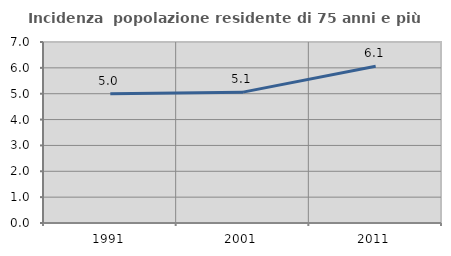
| Category | Incidenza  popolazione residente di 75 anni e più |
|---|---|
| 1991.0 | 5.002 |
| 2001.0 | 5.061 |
| 2011.0 | 6.061 |